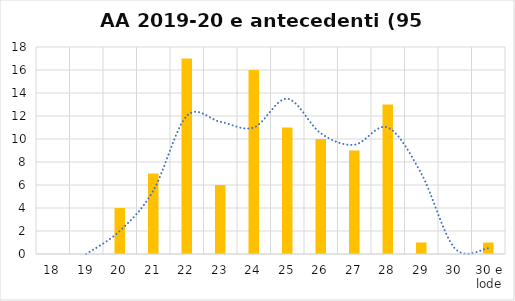
| Category | Series 0 |
|---|---|
| 18 | 0 |
| 19 | 0 |
| 20 | 4 |
| 21 | 7 |
| 22 | 17 |
| 23 | 6 |
| 24 | 16 |
| 25 | 11 |
| 26 | 10 |
| 27 | 9 |
| 28 | 13 |
| 29 | 1 |
| 30 | 0 |
| 30 e lode | 1 |